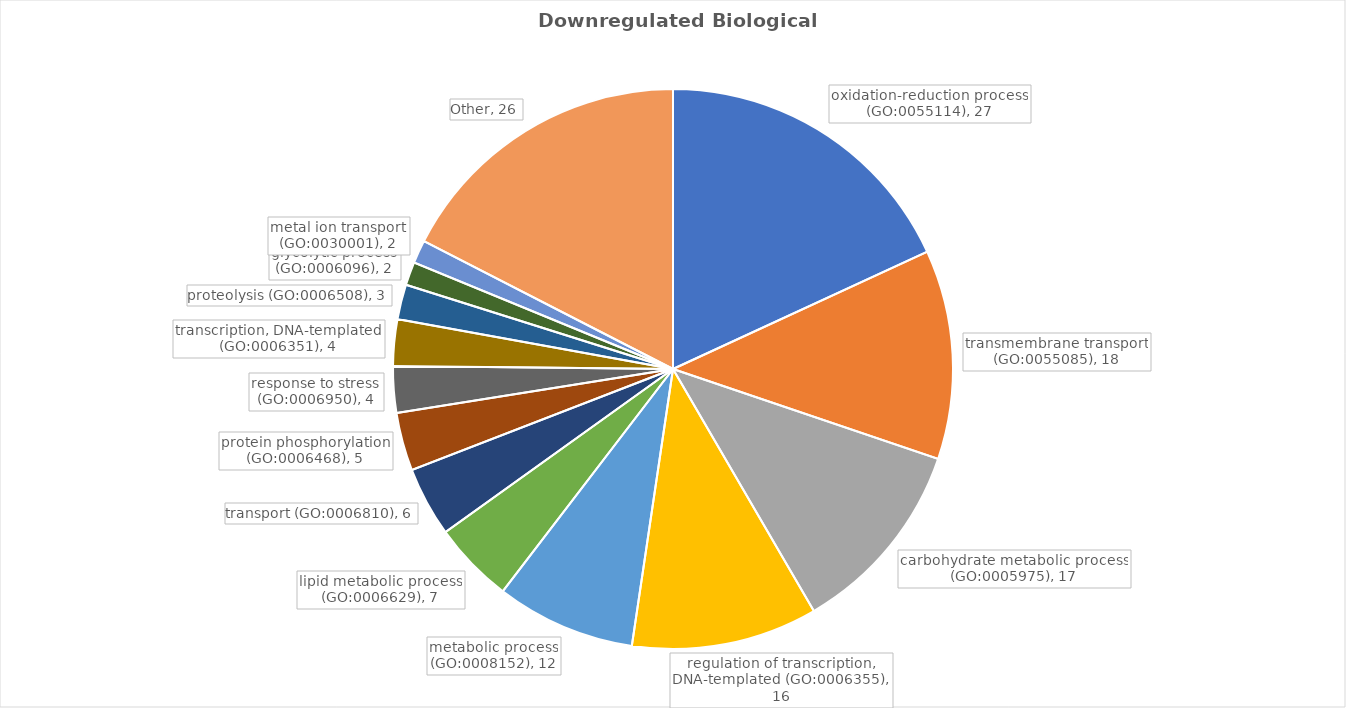
| Category | Genes |
|---|---|
| oxidation-reduction process (GO:0055114) | 27 |
| transmembrane transport (GO:0055085) | 18 |
| carbohydrate metabolic process (GO:0005975) | 17 |
| regulation of transcription, DNA-templated (GO:0006355) | 16 |
| metabolic process (GO:0008152) | 12 |
| lipid metabolic process (GO:0006629) | 7 |
| transport (GO:0006810) | 6 |
| protein phosphorylation (GO:0006468) | 5 |
| response to stress (GO:0006950) | 4 |
| transcription, DNA-templated (GO:0006351) | 4 |
| proteolysis (GO:0006508) | 3 |
| glycolytic process (GO:0006096) | 2 |
| metal ion transport (GO:0030001) | 2 |
| Other | 26 |